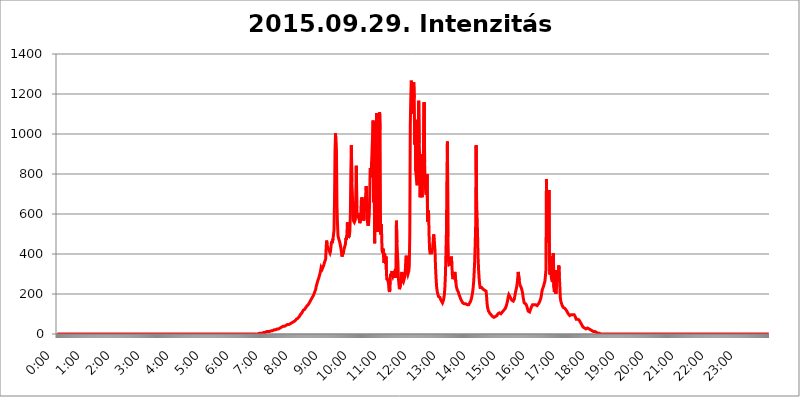
| Category | 2015.09.29. Intenzitás [W/m^2] |
|---|---|
| 0.0 | 0 |
| 0.0006944444444444445 | 0 |
| 0.001388888888888889 | 0 |
| 0.0020833333333333333 | 0 |
| 0.002777777777777778 | 0 |
| 0.003472222222222222 | 0 |
| 0.004166666666666667 | 0 |
| 0.004861111111111111 | 0 |
| 0.005555555555555556 | 0 |
| 0.0062499999999999995 | 0 |
| 0.006944444444444444 | 0 |
| 0.007638888888888889 | 0 |
| 0.008333333333333333 | 0 |
| 0.009027777777777779 | 0 |
| 0.009722222222222222 | 0 |
| 0.010416666666666666 | 0 |
| 0.011111111111111112 | 0 |
| 0.011805555555555555 | 0 |
| 0.012499999999999999 | 0 |
| 0.013194444444444444 | 0 |
| 0.013888888888888888 | 0 |
| 0.014583333333333332 | 0 |
| 0.015277777777777777 | 0 |
| 0.015972222222222224 | 0 |
| 0.016666666666666666 | 0 |
| 0.017361111111111112 | 0 |
| 0.018055555555555557 | 0 |
| 0.01875 | 0 |
| 0.019444444444444445 | 0 |
| 0.02013888888888889 | 0 |
| 0.020833333333333332 | 0 |
| 0.02152777777777778 | 0 |
| 0.022222222222222223 | 0 |
| 0.02291666666666667 | 0 |
| 0.02361111111111111 | 0 |
| 0.024305555555555556 | 0 |
| 0.024999999999999998 | 0 |
| 0.025694444444444447 | 0 |
| 0.02638888888888889 | 0 |
| 0.027083333333333334 | 0 |
| 0.027777777777777776 | 0 |
| 0.02847222222222222 | 0 |
| 0.029166666666666664 | 0 |
| 0.029861111111111113 | 0 |
| 0.030555555555555555 | 0 |
| 0.03125 | 0 |
| 0.03194444444444445 | 0 |
| 0.03263888888888889 | 0 |
| 0.03333333333333333 | 0 |
| 0.034027777777777775 | 0 |
| 0.034722222222222224 | 0 |
| 0.035416666666666666 | 0 |
| 0.036111111111111115 | 0 |
| 0.03680555555555556 | 0 |
| 0.0375 | 0 |
| 0.03819444444444444 | 0 |
| 0.03888888888888889 | 0 |
| 0.03958333333333333 | 0 |
| 0.04027777777777778 | 0 |
| 0.04097222222222222 | 0 |
| 0.041666666666666664 | 0 |
| 0.042361111111111106 | 0 |
| 0.04305555555555556 | 0 |
| 0.043750000000000004 | 0 |
| 0.044444444444444446 | 0 |
| 0.04513888888888889 | 0 |
| 0.04583333333333334 | 0 |
| 0.04652777777777778 | 0 |
| 0.04722222222222222 | 0 |
| 0.04791666666666666 | 0 |
| 0.04861111111111111 | 0 |
| 0.049305555555555554 | 0 |
| 0.049999999999999996 | 0 |
| 0.05069444444444445 | 0 |
| 0.051388888888888894 | 0 |
| 0.052083333333333336 | 0 |
| 0.05277777777777778 | 0 |
| 0.05347222222222222 | 0 |
| 0.05416666666666667 | 0 |
| 0.05486111111111111 | 0 |
| 0.05555555555555555 | 0 |
| 0.05625 | 0 |
| 0.05694444444444444 | 0 |
| 0.057638888888888885 | 0 |
| 0.05833333333333333 | 0 |
| 0.05902777777777778 | 0 |
| 0.059722222222222225 | 0 |
| 0.06041666666666667 | 0 |
| 0.061111111111111116 | 0 |
| 0.06180555555555556 | 0 |
| 0.0625 | 0 |
| 0.06319444444444444 | 0 |
| 0.06388888888888888 | 0 |
| 0.06458333333333334 | 0 |
| 0.06527777777777778 | 0 |
| 0.06597222222222222 | 0 |
| 0.06666666666666667 | 0 |
| 0.06736111111111111 | 0 |
| 0.06805555555555555 | 0 |
| 0.06874999999999999 | 0 |
| 0.06944444444444443 | 0 |
| 0.07013888888888889 | 0 |
| 0.07083333333333333 | 0 |
| 0.07152777777777779 | 0 |
| 0.07222222222222223 | 0 |
| 0.07291666666666667 | 0 |
| 0.07361111111111111 | 0 |
| 0.07430555555555556 | 0 |
| 0.075 | 0 |
| 0.07569444444444444 | 0 |
| 0.0763888888888889 | 0 |
| 0.07708333333333334 | 0 |
| 0.07777777777777778 | 0 |
| 0.07847222222222222 | 0 |
| 0.07916666666666666 | 0 |
| 0.0798611111111111 | 0 |
| 0.08055555555555556 | 0 |
| 0.08125 | 0 |
| 0.08194444444444444 | 0 |
| 0.08263888888888889 | 0 |
| 0.08333333333333333 | 0 |
| 0.08402777777777777 | 0 |
| 0.08472222222222221 | 0 |
| 0.08541666666666665 | 0 |
| 0.08611111111111112 | 0 |
| 0.08680555555555557 | 0 |
| 0.08750000000000001 | 0 |
| 0.08819444444444445 | 0 |
| 0.08888888888888889 | 0 |
| 0.08958333333333333 | 0 |
| 0.09027777777777778 | 0 |
| 0.09097222222222222 | 0 |
| 0.09166666666666667 | 0 |
| 0.09236111111111112 | 0 |
| 0.09305555555555556 | 0 |
| 0.09375 | 0 |
| 0.09444444444444444 | 0 |
| 0.09513888888888888 | 0 |
| 0.09583333333333333 | 0 |
| 0.09652777777777777 | 0 |
| 0.09722222222222222 | 0 |
| 0.09791666666666667 | 0 |
| 0.09861111111111111 | 0 |
| 0.09930555555555555 | 0 |
| 0.09999999999999999 | 0 |
| 0.10069444444444443 | 0 |
| 0.1013888888888889 | 0 |
| 0.10208333333333335 | 0 |
| 0.10277777777777779 | 0 |
| 0.10347222222222223 | 0 |
| 0.10416666666666667 | 0 |
| 0.10486111111111111 | 0 |
| 0.10555555555555556 | 0 |
| 0.10625 | 0 |
| 0.10694444444444444 | 0 |
| 0.1076388888888889 | 0 |
| 0.10833333333333334 | 0 |
| 0.10902777777777778 | 0 |
| 0.10972222222222222 | 0 |
| 0.1111111111111111 | 0 |
| 0.11180555555555556 | 0 |
| 0.11180555555555556 | 0 |
| 0.1125 | 0 |
| 0.11319444444444444 | 0 |
| 0.11388888888888889 | 0 |
| 0.11458333333333333 | 0 |
| 0.11527777777777777 | 0 |
| 0.11597222222222221 | 0 |
| 0.11666666666666665 | 0 |
| 0.1173611111111111 | 0 |
| 0.11805555555555557 | 0 |
| 0.11944444444444445 | 0 |
| 0.12013888888888889 | 0 |
| 0.12083333333333333 | 0 |
| 0.12152777777777778 | 0 |
| 0.12222222222222223 | 0 |
| 0.12291666666666667 | 0 |
| 0.12291666666666667 | 0 |
| 0.12361111111111112 | 0 |
| 0.12430555555555556 | 0 |
| 0.125 | 0 |
| 0.12569444444444444 | 0 |
| 0.12638888888888888 | 0 |
| 0.12708333333333333 | 0 |
| 0.16875 | 0 |
| 0.12847222222222224 | 0 |
| 0.12916666666666668 | 0 |
| 0.12986111111111112 | 0 |
| 0.13055555555555556 | 0 |
| 0.13125 | 0 |
| 0.13194444444444445 | 0 |
| 0.1326388888888889 | 0 |
| 0.13333333333333333 | 0 |
| 0.13402777777777777 | 0 |
| 0.13402777777777777 | 0 |
| 0.13472222222222222 | 0 |
| 0.13541666666666666 | 0 |
| 0.1361111111111111 | 0 |
| 0.13749999999999998 | 0 |
| 0.13819444444444443 | 0 |
| 0.1388888888888889 | 0 |
| 0.13958333333333334 | 0 |
| 0.14027777777777778 | 0 |
| 0.14097222222222222 | 0 |
| 0.14166666666666666 | 0 |
| 0.1423611111111111 | 0 |
| 0.14305555555555557 | 0 |
| 0.14375000000000002 | 0 |
| 0.14444444444444446 | 0 |
| 0.1451388888888889 | 0 |
| 0.1451388888888889 | 0 |
| 0.14652777777777778 | 0 |
| 0.14722222222222223 | 0 |
| 0.14791666666666667 | 0 |
| 0.1486111111111111 | 0 |
| 0.14930555555555555 | 0 |
| 0.15 | 0 |
| 0.15069444444444444 | 0 |
| 0.15138888888888888 | 0 |
| 0.15208333333333332 | 0 |
| 0.15277777777777776 | 0 |
| 0.15347222222222223 | 0 |
| 0.15416666666666667 | 0 |
| 0.15486111111111112 | 0 |
| 0.15555555555555556 | 0 |
| 0.15625 | 0 |
| 0.15694444444444444 | 0 |
| 0.15763888888888888 | 0 |
| 0.15833333333333333 | 0 |
| 0.15902777777777777 | 0 |
| 0.15972222222222224 | 0 |
| 0.16041666666666668 | 0 |
| 0.16111111111111112 | 0 |
| 0.16180555555555556 | 0 |
| 0.1625 | 0 |
| 0.16319444444444445 | 0 |
| 0.1638888888888889 | 0 |
| 0.16458333333333333 | 0 |
| 0.16527777777777777 | 0 |
| 0.16597222222222222 | 0 |
| 0.16666666666666666 | 0 |
| 0.1673611111111111 | 0 |
| 0.16805555555555554 | 0 |
| 0.16874999999999998 | 0 |
| 0.16944444444444443 | 0 |
| 0.17013888888888887 | 0 |
| 0.1708333333333333 | 0 |
| 0.17152777777777775 | 0 |
| 0.17222222222222225 | 0 |
| 0.1729166666666667 | 0 |
| 0.17361111111111113 | 0 |
| 0.17430555555555557 | 0 |
| 0.17500000000000002 | 0 |
| 0.17569444444444446 | 0 |
| 0.1763888888888889 | 0 |
| 0.17708333333333334 | 0 |
| 0.17777777777777778 | 0 |
| 0.17847222222222223 | 0 |
| 0.17916666666666667 | 0 |
| 0.1798611111111111 | 0 |
| 0.18055555555555555 | 0 |
| 0.18125 | 0 |
| 0.18194444444444444 | 0 |
| 0.1826388888888889 | 0 |
| 0.18333333333333335 | 0 |
| 0.1840277777777778 | 0 |
| 0.18472222222222223 | 0 |
| 0.18541666666666667 | 0 |
| 0.18611111111111112 | 0 |
| 0.18680555555555556 | 0 |
| 0.1875 | 0 |
| 0.18819444444444444 | 0 |
| 0.18888888888888888 | 0 |
| 0.18958333333333333 | 0 |
| 0.19027777777777777 | 0 |
| 0.1909722222222222 | 0 |
| 0.19166666666666665 | 0 |
| 0.19236111111111112 | 0 |
| 0.19305555555555554 | 0 |
| 0.19375 | 0 |
| 0.19444444444444445 | 0 |
| 0.1951388888888889 | 0 |
| 0.19583333333333333 | 0 |
| 0.19652777777777777 | 0 |
| 0.19722222222222222 | 0 |
| 0.19791666666666666 | 0 |
| 0.1986111111111111 | 0 |
| 0.19930555555555554 | 0 |
| 0.19999999999999998 | 0 |
| 0.20069444444444443 | 0 |
| 0.20138888888888887 | 0 |
| 0.2020833333333333 | 0 |
| 0.2027777777777778 | 0 |
| 0.2034722222222222 | 0 |
| 0.2041666666666667 | 0 |
| 0.20486111111111113 | 0 |
| 0.20555555555555557 | 0 |
| 0.20625000000000002 | 0 |
| 0.20694444444444446 | 0 |
| 0.2076388888888889 | 0 |
| 0.20833333333333334 | 0 |
| 0.20902777777777778 | 0 |
| 0.20972222222222223 | 0 |
| 0.21041666666666667 | 0 |
| 0.2111111111111111 | 0 |
| 0.21180555555555555 | 0 |
| 0.2125 | 0 |
| 0.21319444444444444 | 0 |
| 0.2138888888888889 | 0 |
| 0.21458333333333335 | 0 |
| 0.2152777777777778 | 0 |
| 0.21597222222222223 | 0 |
| 0.21666666666666667 | 0 |
| 0.21736111111111112 | 0 |
| 0.21805555555555556 | 0 |
| 0.21875 | 0 |
| 0.21944444444444444 | 0 |
| 0.22013888888888888 | 0 |
| 0.22083333333333333 | 0 |
| 0.22152777777777777 | 0 |
| 0.2222222222222222 | 0 |
| 0.22291666666666665 | 0 |
| 0.2236111111111111 | 0 |
| 0.22430555555555556 | 0 |
| 0.225 | 0 |
| 0.22569444444444445 | 0 |
| 0.2263888888888889 | 0 |
| 0.22708333333333333 | 0 |
| 0.22777777777777777 | 0 |
| 0.22847222222222222 | 0 |
| 0.22916666666666666 | 0 |
| 0.2298611111111111 | 0 |
| 0.23055555555555554 | 0 |
| 0.23124999999999998 | 0 |
| 0.23194444444444443 | 0 |
| 0.23263888888888887 | 0 |
| 0.2333333333333333 | 0 |
| 0.2340277777777778 | 0 |
| 0.2347222222222222 | 0 |
| 0.2354166666666667 | 0 |
| 0.23611111111111113 | 0 |
| 0.23680555555555557 | 0 |
| 0.23750000000000002 | 0 |
| 0.23819444444444446 | 0 |
| 0.2388888888888889 | 0 |
| 0.23958333333333334 | 0 |
| 0.24027777777777778 | 0 |
| 0.24097222222222223 | 0 |
| 0.24166666666666667 | 0 |
| 0.2423611111111111 | 0 |
| 0.24305555555555555 | 0 |
| 0.24375 | 0 |
| 0.24444444444444446 | 0 |
| 0.24513888888888888 | 0 |
| 0.24583333333333335 | 0 |
| 0.2465277777777778 | 0 |
| 0.24722222222222223 | 0 |
| 0.24791666666666667 | 0 |
| 0.24861111111111112 | 0 |
| 0.24930555555555556 | 0 |
| 0.25 | 0 |
| 0.25069444444444444 | 0 |
| 0.2513888888888889 | 0 |
| 0.2520833333333333 | 0 |
| 0.25277777777777777 | 0 |
| 0.2534722222222222 | 0 |
| 0.25416666666666665 | 0 |
| 0.2548611111111111 | 0 |
| 0.2555555555555556 | 0 |
| 0.25625000000000003 | 0 |
| 0.2569444444444445 | 0 |
| 0.2576388888888889 | 0 |
| 0.25833333333333336 | 0 |
| 0.2590277777777778 | 0 |
| 0.25972222222222224 | 0 |
| 0.2604166666666667 | 0 |
| 0.2611111111111111 | 0 |
| 0.26180555555555557 | 0 |
| 0.2625 | 0 |
| 0.26319444444444445 | 0 |
| 0.2638888888888889 | 0 |
| 0.26458333333333334 | 0 |
| 0.2652777777777778 | 0 |
| 0.2659722222222222 | 0 |
| 0.26666666666666666 | 0 |
| 0.2673611111111111 | 0 |
| 0.26805555555555555 | 0 |
| 0.26875 | 0 |
| 0.26944444444444443 | 0 |
| 0.2701388888888889 | 0 |
| 0.2708333333333333 | 0 |
| 0.27152777777777776 | 0 |
| 0.2722222222222222 | 0 |
| 0.27291666666666664 | 0 |
| 0.2736111111111111 | 0 |
| 0.2743055555555555 | 0 |
| 0.27499999999999997 | 0 |
| 0.27569444444444446 | 0 |
| 0.27638888888888885 | 0 |
| 0.27708333333333335 | 0 |
| 0.2777777777777778 | 0 |
| 0.27847222222222223 | 0 |
| 0.2791666666666667 | 0 |
| 0.2798611111111111 | 0 |
| 0.28055555555555556 | 0 |
| 0.28125 | 0 |
| 0.28194444444444444 | 0 |
| 0.2826388888888889 | 0 |
| 0.2833333333333333 | 3.525 |
| 0.28402777777777777 | 3.525 |
| 0.2847222222222222 | 3.525 |
| 0.28541666666666665 | 3.525 |
| 0.28611111111111115 | 3.525 |
| 0.28680555555555554 | 3.525 |
| 0.28750000000000003 | 3.525 |
| 0.2881944444444445 | 3.525 |
| 0.2888888888888889 | 3.525 |
| 0.28958333333333336 | 7.887 |
| 0.2902777777777778 | 7.887 |
| 0.29097222222222224 | 7.887 |
| 0.2916666666666667 | 7.887 |
| 0.2923611111111111 | 7.887 |
| 0.29305555555555557 | 12.257 |
| 0.29375 | 12.257 |
| 0.29444444444444445 | 12.257 |
| 0.2951388888888889 | 12.257 |
| 0.29583333333333334 | 12.257 |
| 0.2965277777777778 | 12.257 |
| 0.2972222222222222 | 12.257 |
| 0.29791666666666666 | 12.257 |
| 0.2986111111111111 | 12.257 |
| 0.29930555555555555 | 16.636 |
| 0.3 | 16.636 |
| 0.30069444444444443 | 16.636 |
| 0.3013888888888889 | 16.636 |
| 0.3020833333333333 | 16.636 |
| 0.30277777777777776 | 21.024 |
| 0.3034722222222222 | 21.024 |
| 0.30416666666666664 | 21.024 |
| 0.3048611111111111 | 21.024 |
| 0.3055555555555555 | 21.024 |
| 0.30624999999999997 | 21.024 |
| 0.3069444444444444 | 25.419 |
| 0.3076388888888889 | 25.419 |
| 0.30833333333333335 | 25.419 |
| 0.3090277777777778 | 25.419 |
| 0.30972222222222223 | 25.419 |
| 0.3104166666666667 | 25.419 |
| 0.3111111111111111 | 29.823 |
| 0.31180555555555556 | 29.823 |
| 0.3125 | 29.823 |
| 0.31319444444444444 | 29.823 |
| 0.3138888888888889 | 29.823 |
| 0.3145833333333333 | 34.234 |
| 0.31527777777777777 | 34.234 |
| 0.3159722222222222 | 34.234 |
| 0.31666666666666665 | 38.653 |
| 0.31736111111111115 | 38.653 |
| 0.31805555555555554 | 38.653 |
| 0.31875000000000003 | 38.653 |
| 0.3194444444444445 | 38.653 |
| 0.3201388888888889 | 43.079 |
| 0.32083333333333336 | 43.079 |
| 0.3215277777777778 | 43.079 |
| 0.32222222222222224 | 47.511 |
| 0.3229166666666667 | 47.511 |
| 0.3236111111111111 | 47.511 |
| 0.32430555555555557 | 47.511 |
| 0.325 | 47.511 |
| 0.32569444444444445 | 51.951 |
| 0.3263888888888889 | 51.951 |
| 0.32708333333333334 | 51.951 |
| 0.3277777777777778 | 56.398 |
| 0.3284722222222222 | 56.398 |
| 0.32916666666666666 | 56.398 |
| 0.3298611111111111 | 56.398 |
| 0.33055555555555555 | 60.85 |
| 0.33125 | 60.85 |
| 0.33194444444444443 | 65.31 |
| 0.3326388888888889 | 65.31 |
| 0.3333333333333333 | 65.31 |
| 0.3340277777777778 | 69.775 |
| 0.3347222222222222 | 69.775 |
| 0.3354166666666667 | 74.246 |
| 0.3361111111111111 | 74.246 |
| 0.3368055555555556 | 78.722 |
| 0.33749999999999997 | 78.722 |
| 0.33819444444444446 | 83.205 |
| 0.33888888888888885 | 83.205 |
| 0.33958333333333335 | 87.692 |
| 0.34027777777777773 | 92.184 |
| 0.34097222222222223 | 96.682 |
| 0.3416666666666666 | 101.184 |
| 0.3423611111111111 | 101.184 |
| 0.3430555555555555 | 105.69 |
| 0.34375 | 110.201 |
| 0.3444444444444445 | 110.201 |
| 0.3451388888888889 | 119.235 |
| 0.3458333333333334 | 119.235 |
| 0.34652777777777777 | 119.235 |
| 0.34722222222222227 | 123.758 |
| 0.34791666666666665 | 128.284 |
| 0.34861111111111115 | 132.814 |
| 0.34930555555555554 | 137.347 |
| 0.35000000000000003 | 137.347 |
| 0.3506944444444444 | 141.884 |
| 0.3513888888888889 | 146.423 |
| 0.3520833333333333 | 146.423 |
| 0.3527777777777778 | 150.964 |
| 0.3534722222222222 | 155.509 |
| 0.3541666666666667 | 160.056 |
| 0.3548611111111111 | 164.605 |
| 0.35555555555555557 | 169.156 |
| 0.35625 | 173.709 |
| 0.35694444444444445 | 178.264 |
| 0.3576388888888889 | 182.82 |
| 0.35833333333333334 | 187.378 |
| 0.3590277777777778 | 191.937 |
| 0.3597222222222222 | 196.497 |
| 0.36041666666666666 | 201.058 |
| 0.3611111111111111 | 210.182 |
| 0.36180555555555555 | 214.746 |
| 0.3625 | 223.873 |
| 0.36319444444444443 | 237.564 |
| 0.3638888888888889 | 246.689 |
| 0.3645833333333333 | 255.813 |
| 0.3652777777777778 | 264.932 |
| 0.3659722222222222 | 269.49 |
| 0.3666666666666667 | 278.603 |
| 0.3673611111111111 | 283.156 |
| 0.3680555555555556 | 296.808 |
| 0.36874999999999997 | 305.898 |
| 0.36944444444444446 | 319.517 |
| 0.37013888888888885 | 333.113 |
| 0.37083333333333335 | 328.584 |
| 0.37152777777777773 | 324.052 |
| 0.37222222222222223 | 324.052 |
| 0.3729166666666666 | 328.584 |
| 0.3736111111111111 | 342.162 |
| 0.3743055555555555 | 351.198 |
| 0.375 | 360.221 |
| 0.3756944444444445 | 364.728 |
| 0.3763888888888889 | 373.729 |
| 0.3770833333333334 | 422.943 |
| 0.37777777777777777 | 467.187 |
| 0.37847222222222227 | 449.551 |
| 0.37916666666666665 | 431.833 |
| 0.37986111111111115 | 427.39 |
| 0.38055555555555554 | 422.943 |
| 0.38125000000000003 | 427.39 |
| 0.3819444444444444 | 418.492 |
| 0.3826388888888889 | 405.108 |
| 0.3833333333333333 | 414.035 |
| 0.3840277777777778 | 440.702 |
| 0.3847222222222222 | 462.786 |
| 0.3854166666666667 | 453.968 |
| 0.3861111111111111 | 449.551 |
| 0.38680555555555557 | 475.972 |
| 0.3875 | 497.836 |
| 0.38819444444444445 | 519.555 |
| 0.3888888888888889 | 667.123 |
| 0.38958333333333334 | 913.766 |
| 0.3902777777777778 | 1003.65 |
| 0.3909722222222222 | 1003.65 |
| 0.39166666666666666 | 887.309 |
| 0.3923611111111111 | 634.105 |
| 0.39305555555555555 | 549.704 |
| 0.39375 | 493.475 |
| 0.39444444444444443 | 480.356 |
| 0.3951388888888889 | 471.582 |
| 0.3958333333333333 | 467.187 |
| 0.3965277777777778 | 453.968 |
| 0.3972222222222222 | 440.702 |
| 0.3979166666666667 | 427.39 |
| 0.3986111111111111 | 409.574 |
| 0.3993055555555556 | 387.202 |
| 0.39999999999999997 | 396.164 |
| 0.40069444444444446 | 391.685 |
| 0.40138888888888885 | 405.108 |
| 0.40208333333333335 | 422.943 |
| 0.40277777777777773 | 431.833 |
| 0.40347222222222223 | 427.39 |
| 0.4041666666666666 | 449.551 |
| 0.4048611111111111 | 480.356 |
| 0.4055555555555555 | 471.582 |
| 0.40625 | 493.475 |
| 0.4069444444444445 | 558.261 |
| 0.4076388888888889 | 497.836 |
| 0.4083333333333334 | 480.356 |
| 0.40902777777777777 | 480.356 |
| 0.40972222222222227 | 493.475 |
| 0.41041666666666665 | 515.223 |
| 0.41111111111111115 | 600.661 |
| 0.41180555555555554 | 814.519 |
| 0.41250000000000003 | 943.832 |
| 0.4131944444444444 | 759.723 |
| 0.4138888888888889 | 703.762 |
| 0.4145833333333333 | 613.252 |
| 0.4152777777777778 | 566.793 |
| 0.4159722222222222 | 562.53 |
| 0.4166666666666667 | 558.261 |
| 0.4173611111111111 | 558.261 |
| 0.41805555555555557 | 571.049 |
| 0.41875 | 703.762 |
| 0.41944444444444445 | 841.526 |
| 0.4201388888888889 | 634.105 |
| 0.42083333333333334 | 579.542 |
| 0.4215277777777778 | 588.009 |
| 0.4222222222222222 | 604.864 |
| 0.42291666666666666 | 609.062 |
| 0.4236111111111111 | 571.049 |
| 0.42430555555555555 | 553.986 |
| 0.425 | 553.986 |
| 0.42569444444444443 | 575.299 |
| 0.4263888888888889 | 663.019 |
| 0.4270833333333333 | 683.473 |
| 0.4277777777777778 | 687.544 |
| 0.4284722222222222 | 667.123 |
| 0.4291666666666667 | 604.864 |
| 0.4298611111111111 | 566.793 |
| 0.4305555555555556 | 588.009 |
| 0.43124999999999997 | 663.019 |
| 0.43194444444444446 | 667.123 |
| 0.43263888888888885 | 691.608 |
| 0.43333333333333335 | 739.877 |
| 0.43402777777777773 | 671.22 |
| 0.43472222222222223 | 579.542 |
| 0.4354166666666666 | 549.704 |
| 0.4361111111111111 | 541.121 |
| 0.4368055555555555 | 558.261 |
| 0.4375 | 592.233 |
| 0.4381944444444445 | 675.311 |
| 0.4388888888888889 | 829.981 |
| 0.4395833333333334 | 822.26 |
| 0.44027777777777777 | 783.342 |
| 0.44097222222222227 | 860.676 |
| 0.44166666666666665 | 932.576 |
| 0.44236111111111115 | 999.916 |
| 0.44305555555555554 | 1067.267 |
| 0.44375000000000003 | 658.909 |
| 0.4444444444444444 | 992.448 |
| 0.4451388888888889 | 453.968 |
| 0.4458333333333333 | 1059.756 |
| 0.4465277777777778 | 727.896 |
| 0.4472222222222222 | 921.298 |
| 0.4479166666666667 | 1105.019 |
| 0.4486111111111111 | 510.885 |
| 0.44930555555555557 | 532.513 |
| 0.45 | 642.4 |
| 0.45069444444444445 | 621.613 |
| 0.4513888888888889 | 592.233 |
| 0.45208333333333334 | 1108.816 |
| 0.4527777777777778 | 1022.323 |
| 0.4534722222222222 | 497.836 |
| 0.45416666666666666 | 549.704 |
| 0.4548611111111111 | 515.223 |
| 0.45555555555555555 | 418.492 |
| 0.45625 | 405.108 |
| 0.45694444444444443 | 427.39 |
| 0.4576388888888889 | 391.685 |
| 0.4583333333333333 | 355.712 |
| 0.4590277777777778 | 405.108 |
| 0.4597222222222222 | 378.224 |
| 0.4604166666666667 | 351.198 |
| 0.4611111111111111 | 387.202 |
| 0.4618055555555556 | 296.808 |
| 0.46249999999999997 | 269.49 |
| 0.46319444444444446 | 278.603 |
| 0.46388888888888885 | 283.156 |
| 0.46458333333333335 | 255.813 |
| 0.46527777777777773 | 219.309 |
| 0.46597222222222223 | 210.182 |
| 0.4666666666666666 | 223.873 |
| 0.4673611111111111 | 301.354 |
| 0.4680555555555555 | 287.709 |
| 0.46875 | 301.354 |
| 0.4694444444444445 | 314.98 |
| 0.4701388888888889 | 296.808 |
| 0.4708333333333334 | 287.709 |
| 0.47152777777777777 | 287.709 |
| 0.47222222222222227 | 301.354 |
| 0.47291666666666665 | 287.709 |
| 0.47361111111111115 | 292.259 |
| 0.47430555555555554 | 287.709 |
| 0.47500000000000003 | 287.709 |
| 0.4756944444444444 | 566.793 |
| 0.4763888888888889 | 458.38 |
| 0.4770833333333333 | 409.574 |
| 0.4777777777777778 | 360.221 |
| 0.4784722222222222 | 278.603 |
| 0.4791666666666667 | 251.251 |
| 0.4798611111111111 | 223.873 |
| 0.48055555555555557 | 219.309 |
| 0.48125 | 242.127 |
| 0.48194444444444445 | 260.373 |
| 0.4826388888888889 | 264.932 |
| 0.48333333333333334 | 310.44 |
| 0.4840277777777778 | 269.49 |
| 0.4847222222222222 | 264.932 |
| 0.48541666666666666 | 260.373 |
| 0.4861111111111111 | 255.813 |
| 0.48680555555555555 | 264.932 |
| 0.4875 | 287.709 |
| 0.48819444444444443 | 319.517 |
| 0.4888888888888889 | 373.729 |
| 0.4895833333333333 | 391.685 |
| 0.4902777777777778 | 337.639 |
| 0.4909722222222222 | 305.898 |
| 0.4916666666666667 | 296.808 |
| 0.4923611111111111 | 301.354 |
| 0.4930555555555556 | 314.98 |
| 0.49374999999999997 | 342.162 |
| 0.49444444444444446 | 497.836 |
| 0.49513888888888885 | 1041.019 |
| 0.49583333333333335 | 1174.263 |
| 0.49652777777777773 | 1266.8 |
| 0.49722222222222223 | 1246.176 |
| 0.4979166666666666 | 1101.226 |
| 0.4986111111111111 | 1221.83 |
| 0.4993055555555555 | 1242.089 |
| 0.5 | 1258.511 |
| 0.5006944444444444 | 1178.177 |
| 0.5013888888888889 | 947.58 |
| 0.5020833333333333 | 1071.027 |
| 0.5027777777777778 | 814.519 |
| 0.5034722222222222 | 791.169 |
| 0.5041666666666667 | 759.723 |
| 0.5048611111111111 | 743.859 |
| 0.5055555555555555 | 806.757 |
| 0.50625 | 940.082 |
| 0.5069444444444444 | 1166.46 |
| 0.5076388888888889 | 955.071 |
| 0.5083333333333333 | 875.918 |
| 0.5090277777777777 | 683.473 |
| 0.5097222222222222 | 898.668 |
| 0.5104166666666666 | 767.62 |
| 0.5111111111111112 | 695.666 |
| 0.5118055555555555 | 683.473 |
| 0.5125000000000001 | 818.392 |
| 0.5131944444444444 | 791.169 |
| 0.513888888888889 | 795.074 |
| 0.5145833333333333 | 1158.689 |
| 0.5152777777777778 | 853.029 |
| 0.5159722222222222 | 755.766 |
| 0.5166666666666667 | 719.877 |
| 0.517361111111111 | 695.666 |
| 0.5180555555555556 | 699.717 |
| 0.5187499999999999 | 798.974 |
| 0.5194444444444445 | 562.53 |
| 0.5201388888888888 | 617.436 |
| 0.5208333333333334 | 609.062 |
| 0.5215277777777778 | 493.475 |
| 0.5222222222222223 | 422.943 |
| 0.5229166666666667 | 405.108 |
| 0.5236111111111111 | 405.108 |
| 0.5243055555555556 | 409.574 |
| 0.525 | 405.108 |
| 0.5256944444444445 | 405.108 |
| 0.5263888888888889 | 427.39 |
| 0.5270833333333333 | 453.968 |
| 0.5277777777777778 | 497.836 |
| 0.5284722222222222 | 489.108 |
| 0.5291666666666667 | 449.551 |
| 0.5298611111111111 | 414.035 |
| 0.5305555555555556 | 333.113 |
| 0.53125 | 283.156 |
| 0.5319444444444444 | 242.127 |
| 0.5326388888888889 | 219.309 |
| 0.5333333333333333 | 205.62 |
| 0.5340277777777778 | 196.497 |
| 0.5347222222222222 | 187.378 |
| 0.5354166666666667 | 187.378 |
| 0.5361111111111111 | 182.82 |
| 0.5368055555555555 | 182.82 |
| 0.5375 | 173.709 |
| 0.5381944444444444 | 169.156 |
| 0.5388888888888889 | 164.605 |
| 0.5395833333333333 | 160.056 |
| 0.5402777777777777 | 155.509 |
| 0.5409722222222222 | 160.056 |
| 0.5416666666666666 | 169.156 |
| 0.5423611111111112 | 182.82 |
| 0.5430555555555555 | 201.058 |
| 0.5437500000000001 | 237.564 |
| 0.5444444444444444 | 296.808 |
| 0.545138888888889 | 400.638 |
| 0.5458333333333333 | 506.542 |
| 0.5465277777777778 | 787.258 |
| 0.5472222222222222 | 962.555 |
| 0.5479166666666667 | 484.735 |
| 0.548611111111111 | 369.23 |
| 0.5493055555555556 | 346.682 |
| 0.5499999999999999 | 342.162 |
| 0.5506944444444445 | 342.162 |
| 0.5513888888888888 | 351.198 |
| 0.5520833333333334 | 360.221 |
| 0.5527777777777778 | 387.202 |
| 0.5534722222222223 | 342.162 |
| 0.5541666666666667 | 296.808 |
| 0.5548611111111111 | 274.047 |
| 0.5555555555555556 | 269.49 |
| 0.55625 | 287.709 |
| 0.5569444444444445 | 301.354 |
| 0.5576388888888889 | 310.44 |
| 0.5583333333333333 | 310.44 |
| 0.5590277777777778 | 260.373 |
| 0.5597222222222222 | 237.564 |
| 0.5604166666666667 | 228.436 |
| 0.5611111111111111 | 219.309 |
| 0.5618055555555556 | 214.746 |
| 0.5625 | 210.182 |
| 0.5631944444444444 | 201.058 |
| 0.5638888888888889 | 196.497 |
| 0.5645833333333333 | 187.378 |
| 0.5652777777777778 | 182.82 |
| 0.5659722222222222 | 173.709 |
| 0.5666666666666667 | 169.156 |
| 0.5673611111111111 | 164.605 |
| 0.5680555555555555 | 160.056 |
| 0.56875 | 155.509 |
| 0.5694444444444444 | 150.964 |
| 0.5701388888888889 | 150.964 |
| 0.5708333333333333 | 150.964 |
| 0.5715277777777777 | 150.964 |
| 0.5722222222222222 | 150.964 |
| 0.5729166666666666 | 150.964 |
| 0.5736111111111112 | 150.964 |
| 0.5743055555555555 | 146.423 |
| 0.5750000000000001 | 146.423 |
| 0.5756944444444444 | 146.423 |
| 0.576388888888889 | 146.423 |
| 0.5770833333333333 | 146.423 |
| 0.5777777777777778 | 150.964 |
| 0.5784722222222222 | 155.509 |
| 0.5791666666666667 | 160.056 |
| 0.579861111111111 | 164.605 |
| 0.5805555555555556 | 173.709 |
| 0.5812499999999999 | 182.82 |
| 0.5819444444444445 | 196.497 |
| 0.5826388888888888 | 210.182 |
| 0.5833333333333334 | 233 |
| 0.5840277777777778 | 260.373 |
| 0.5847222222222223 | 305.898 |
| 0.5854166666666667 | 360.221 |
| 0.5861111111111111 | 436.27 |
| 0.5868055555555556 | 536.82 |
| 0.5875 | 943.832 |
| 0.5881944444444445 | 658.909 |
| 0.5888888888888889 | 579.542 |
| 0.5895833333333333 | 484.735 |
| 0.5902777777777778 | 378.224 |
| 0.5909722222222222 | 319.517 |
| 0.5916666666666667 | 278.603 |
| 0.5923611111111111 | 251.251 |
| 0.5930555555555556 | 233 |
| 0.59375 | 228.436 |
| 0.5944444444444444 | 228.436 |
| 0.5951388888888889 | 233 |
| 0.5958333333333333 | 233 |
| 0.5965277777777778 | 233 |
| 0.5972222222222222 | 223.873 |
| 0.5979166666666667 | 219.309 |
| 0.5986111111111111 | 219.309 |
| 0.5993055555555555 | 219.309 |
| 0.6 | 219.309 |
| 0.6006944444444444 | 219.309 |
| 0.6013888888888889 | 214.746 |
| 0.6020833333333333 | 191.937 |
| 0.6027777777777777 | 155.509 |
| 0.6034722222222222 | 132.814 |
| 0.6041666666666666 | 123.758 |
| 0.6048611111111112 | 114.716 |
| 0.6055555555555555 | 110.201 |
| 0.6062500000000001 | 105.69 |
| 0.6069444444444444 | 101.184 |
| 0.607638888888889 | 101.184 |
| 0.6083333333333333 | 96.682 |
| 0.6090277777777778 | 96.682 |
| 0.6097222222222222 | 92.184 |
| 0.6104166666666667 | 87.692 |
| 0.611111111111111 | 83.205 |
| 0.6118055555555556 | 83.205 |
| 0.6124999999999999 | 83.205 |
| 0.6131944444444445 | 83.205 |
| 0.6138888888888888 | 83.205 |
| 0.6145833333333334 | 87.692 |
| 0.6152777777777778 | 87.692 |
| 0.6159722222222223 | 87.692 |
| 0.6166666666666667 | 92.184 |
| 0.6173611111111111 | 96.682 |
| 0.6180555555555556 | 101.184 |
| 0.61875 | 101.184 |
| 0.6194444444444445 | 105.69 |
| 0.6201388888888889 | 105.69 |
| 0.6208333333333333 | 105.69 |
| 0.6215277777777778 | 105.69 |
| 0.6222222222222222 | 101.184 |
| 0.6229166666666667 | 101.184 |
| 0.6236111111111111 | 105.69 |
| 0.6243055555555556 | 110.201 |
| 0.625 | 110.201 |
| 0.6256944444444444 | 114.716 |
| 0.6263888888888889 | 119.235 |
| 0.6270833333333333 | 119.235 |
| 0.6277777777777778 | 123.758 |
| 0.6284722222222222 | 128.284 |
| 0.6291666666666667 | 132.814 |
| 0.6298611111111111 | 141.884 |
| 0.6305555555555555 | 150.964 |
| 0.63125 | 160.056 |
| 0.6319444444444444 | 173.709 |
| 0.6326388888888889 | 187.378 |
| 0.6333333333333333 | 196.497 |
| 0.6340277777777777 | 201.058 |
| 0.6347222222222222 | 191.937 |
| 0.6354166666666666 | 182.82 |
| 0.6361111111111112 | 178.264 |
| 0.6368055555555555 | 178.264 |
| 0.6375000000000001 | 169.156 |
| 0.6381944444444444 | 164.605 |
| 0.638888888888889 | 164.605 |
| 0.6395833333333333 | 164.605 |
| 0.6402777777777778 | 164.605 |
| 0.6409722222222222 | 173.709 |
| 0.6416666666666667 | 187.378 |
| 0.642361111111111 | 201.058 |
| 0.6430555555555556 | 214.746 |
| 0.6437499999999999 | 223.873 |
| 0.6444444444444445 | 237.564 |
| 0.6451388888888888 | 255.813 |
| 0.6458333333333334 | 278.603 |
| 0.6465277777777778 | 310.44 |
| 0.6472222222222223 | 310.44 |
| 0.6479166666666667 | 269.49 |
| 0.6486111111111111 | 251.251 |
| 0.6493055555555556 | 242.127 |
| 0.65 | 237.564 |
| 0.6506944444444445 | 233 |
| 0.6513888888888889 | 223.873 |
| 0.6520833333333333 | 214.746 |
| 0.6527777777777778 | 201.058 |
| 0.6534722222222222 | 182.82 |
| 0.6541666666666667 | 169.156 |
| 0.6548611111111111 | 155.509 |
| 0.6555555555555556 | 150.964 |
| 0.65625 | 150.964 |
| 0.6569444444444444 | 150.964 |
| 0.6576388888888889 | 146.423 |
| 0.6583333333333333 | 141.884 |
| 0.6590277777777778 | 132.814 |
| 0.6597222222222222 | 123.758 |
| 0.6604166666666667 | 114.716 |
| 0.6611111111111111 | 110.201 |
| 0.6618055555555555 | 110.201 |
| 0.6625 | 110.201 |
| 0.6631944444444444 | 114.716 |
| 0.6638888888888889 | 123.758 |
| 0.6645833333333333 | 128.284 |
| 0.6652777777777777 | 137.347 |
| 0.6659722222222222 | 141.884 |
| 0.6666666666666666 | 146.423 |
| 0.6673611111111111 | 150.964 |
| 0.6680555555555556 | 146.423 |
| 0.6687500000000001 | 146.423 |
| 0.6694444444444444 | 146.423 |
| 0.6701388888888888 | 141.884 |
| 0.6708333333333334 | 146.423 |
| 0.6715277777777778 | 141.884 |
| 0.6722222222222222 | 141.884 |
| 0.6729166666666666 | 141.884 |
| 0.6736111111111112 | 146.423 |
| 0.6743055555555556 | 146.423 |
| 0.6749999999999999 | 150.964 |
| 0.6756944444444444 | 155.509 |
| 0.6763888888888889 | 160.056 |
| 0.6770833333333334 | 164.605 |
| 0.6777777777777777 | 173.709 |
| 0.6784722222222223 | 182.82 |
| 0.6791666666666667 | 196.497 |
| 0.6798611111111111 | 214.746 |
| 0.6805555555555555 | 223.873 |
| 0.68125 | 228.436 |
| 0.6819444444444445 | 237.564 |
| 0.6826388888888889 | 246.689 |
| 0.6833333333333332 | 255.813 |
| 0.6840277777777778 | 264.932 |
| 0.6847222222222222 | 269.49 |
| 0.6854166666666667 | 319.517 |
| 0.686111111111111 | 775.492 |
| 0.6868055555555556 | 506.542 |
| 0.6875 | 471.582 |
| 0.6881944444444444 | 617.436 |
| 0.688888888888889 | 458.38 |
| 0.6895833333333333 | 719.877 |
| 0.6902777777777778 | 364.728 |
| 0.6909722222222222 | 296.808 |
| 0.6916666666666668 | 387.202 |
| 0.6923611111111111 | 364.728 |
| 0.6930555555555555 | 278.603 |
| 0.69375 | 278.603 |
| 0.6944444444444445 | 260.373 |
| 0.6951388888888889 | 255.813 |
| 0.6958333333333333 | 405.108 |
| 0.6965277777777777 | 233 |
| 0.6972222222222223 | 210.182 |
| 0.6979166666666666 | 214.746 |
| 0.6986111111111111 | 319.517 |
| 0.6993055555555556 | 201.058 |
| 0.7000000000000001 | 201.058 |
| 0.7006944444444444 | 278.603 |
| 0.7013888888888888 | 283.156 |
| 0.7020833333333334 | 314.98 |
| 0.7027777777777778 | 301.354 |
| 0.7034722222222222 | 342.162 |
| 0.7041666666666666 | 287.709 |
| 0.7048611111111112 | 242.127 |
| 0.7055555555555556 | 182.82 |
| 0.7062499999999999 | 164.605 |
| 0.7069444444444444 | 155.509 |
| 0.7076388888888889 | 150.964 |
| 0.7083333333333334 | 141.884 |
| 0.7090277777777777 | 137.347 |
| 0.7097222222222223 | 132.814 |
| 0.7104166666666667 | 128.284 |
| 0.7111111111111111 | 128.284 |
| 0.7118055555555555 | 128.284 |
| 0.7125 | 128.284 |
| 0.7131944444444445 | 123.758 |
| 0.7138888888888889 | 119.235 |
| 0.7145833333333332 | 119.235 |
| 0.7152777777777778 | 110.201 |
| 0.7159722222222222 | 105.69 |
| 0.7166666666666667 | 101.184 |
| 0.717361111111111 | 96.682 |
| 0.7180555555555556 | 96.682 |
| 0.71875 | 92.184 |
| 0.7194444444444444 | 92.184 |
| 0.720138888888889 | 92.184 |
| 0.7208333333333333 | 96.682 |
| 0.7215277777777778 | 96.682 |
| 0.7222222222222222 | 96.682 |
| 0.7229166666666668 | 96.682 |
| 0.7236111111111111 | 101.184 |
| 0.7243055555555555 | 96.682 |
| 0.725 | 96.682 |
| 0.7256944444444445 | 92.184 |
| 0.7263888888888889 | 87.692 |
| 0.7270833333333333 | 83.205 |
| 0.7277777777777777 | 74.246 |
| 0.7284722222222223 | 74.246 |
| 0.7291666666666666 | 74.246 |
| 0.7298611111111111 | 74.246 |
| 0.7305555555555556 | 74.246 |
| 0.7312500000000001 | 69.775 |
| 0.7319444444444444 | 69.775 |
| 0.7326388888888888 | 65.31 |
| 0.7333333333333334 | 60.85 |
| 0.7340277777777778 | 56.398 |
| 0.7347222222222222 | 51.951 |
| 0.7354166666666666 | 47.511 |
| 0.7361111111111112 | 43.079 |
| 0.7368055555555556 | 38.653 |
| 0.7374999999999999 | 34.234 |
| 0.7381944444444444 | 34.234 |
| 0.7388888888888889 | 29.823 |
| 0.7395833333333334 | 29.823 |
| 0.7402777777777777 | 25.419 |
| 0.7409722222222223 | 25.419 |
| 0.7416666666666667 | 25.419 |
| 0.7423611111111111 | 29.823 |
| 0.7430555555555555 | 29.823 |
| 0.74375 | 29.823 |
| 0.7444444444444445 | 29.823 |
| 0.7451388888888889 | 25.419 |
| 0.7458333333333332 | 25.419 |
| 0.7465277777777778 | 25.419 |
| 0.7472222222222222 | 21.024 |
| 0.7479166666666667 | 21.024 |
| 0.748611111111111 | 21.024 |
| 0.7493055555555556 | 21.024 |
| 0.75 | 16.636 |
| 0.7506944444444444 | 16.636 |
| 0.751388888888889 | 16.636 |
| 0.7520833333333333 | 12.257 |
| 0.7527777777777778 | 12.257 |
| 0.7534722222222222 | 12.257 |
| 0.7541666666666668 | 12.257 |
| 0.7548611111111111 | 12.257 |
| 0.7555555555555555 | 7.887 |
| 0.75625 | 7.887 |
| 0.7569444444444445 | 7.887 |
| 0.7576388888888889 | 3.525 |
| 0.7583333333333333 | 3.525 |
| 0.7590277777777777 | 3.525 |
| 0.7597222222222223 | 3.525 |
| 0.7604166666666666 | 3.525 |
| 0.7611111111111111 | 3.525 |
| 0.7618055555555556 | 3.525 |
| 0.7625000000000001 | 0 |
| 0.7631944444444444 | 0 |
| 0.7638888888888888 | 0 |
| 0.7645833333333334 | 0 |
| 0.7652777777777778 | 0 |
| 0.7659722222222222 | 0 |
| 0.7666666666666666 | 0 |
| 0.7673611111111112 | 0 |
| 0.7680555555555556 | 0 |
| 0.7687499999999999 | 0 |
| 0.7694444444444444 | 0 |
| 0.7701388888888889 | 0 |
| 0.7708333333333334 | 0 |
| 0.7715277777777777 | 0 |
| 0.7722222222222223 | 0 |
| 0.7729166666666667 | 0 |
| 0.7736111111111111 | 0 |
| 0.7743055555555555 | 0 |
| 0.775 | 0 |
| 0.7756944444444445 | 0 |
| 0.7763888888888889 | 0 |
| 0.7770833333333332 | 0 |
| 0.7777777777777778 | 0 |
| 0.7784722222222222 | 0 |
| 0.7791666666666667 | 0 |
| 0.779861111111111 | 0 |
| 0.7805555555555556 | 0 |
| 0.78125 | 0 |
| 0.7819444444444444 | 0 |
| 0.782638888888889 | 0 |
| 0.7833333333333333 | 0 |
| 0.7840277777777778 | 0 |
| 0.7847222222222222 | 0 |
| 0.7854166666666668 | 0 |
| 0.7861111111111111 | 0 |
| 0.7868055555555555 | 0 |
| 0.7875 | 0 |
| 0.7881944444444445 | 0 |
| 0.7888888888888889 | 0 |
| 0.7895833333333333 | 0 |
| 0.7902777777777777 | 0 |
| 0.7909722222222223 | 0 |
| 0.7916666666666666 | 0 |
| 0.7923611111111111 | 0 |
| 0.7930555555555556 | 0 |
| 0.7937500000000001 | 0 |
| 0.7944444444444444 | 0 |
| 0.7951388888888888 | 0 |
| 0.7958333333333334 | 0 |
| 0.7965277777777778 | 0 |
| 0.7972222222222222 | 0 |
| 0.7979166666666666 | 0 |
| 0.7986111111111112 | 0 |
| 0.7993055555555556 | 0 |
| 0.7999999999999999 | 0 |
| 0.8006944444444444 | 0 |
| 0.8013888888888889 | 0 |
| 0.8020833333333334 | 0 |
| 0.8027777777777777 | 0 |
| 0.8034722222222223 | 0 |
| 0.8041666666666667 | 0 |
| 0.8048611111111111 | 0 |
| 0.8055555555555555 | 0 |
| 0.80625 | 0 |
| 0.8069444444444445 | 0 |
| 0.8076388888888889 | 0 |
| 0.8083333333333332 | 0 |
| 0.8090277777777778 | 0 |
| 0.8097222222222222 | 0 |
| 0.8104166666666667 | 0 |
| 0.811111111111111 | 0 |
| 0.8118055555555556 | 0 |
| 0.8125 | 0 |
| 0.8131944444444444 | 0 |
| 0.813888888888889 | 0 |
| 0.8145833333333333 | 0 |
| 0.8152777777777778 | 0 |
| 0.8159722222222222 | 0 |
| 0.8166666666666668 | 0 |
| 0.8173611111111111 | 0 |
| 0.8180555555555555 | 0 |
| 0.81875 | 0 |
| 0.8194444444444445 | 0 |
| 0.8201388888888889 | 0 |
| 0.8208333333333333 | 0 |
| 0.8215277777777777 | 0 |
| 0.8222222222222223 | 0 |
| 0.8229166666666666 | 0 |
| 0.8236111111111111 | 0 |
| 0.8243055555555556 | 0 |
| 0.8250000000000001 | 0 |
| 0.8256944444444444 | 0 |
| 0.8263888888888888 | 0 |
| 0.8270833333333334 | 0 |
| 0.8277777777777778 | 0 |
| 0.8284722222222222 | 0 |
| 0.8291666666666666 | 0 |
| 0.8298611111111112 | 0 |
| 0.8305555555555556 | 0 |
| 0.8312499999999999 | 0 |
| 0.8319444444444444 | 0 |
| 0.8326388888888889 | 0 |
| 0.8333333333333334 | 0 |
| 0.8340277777777777 | 0 |
| 0.8347222222222223 | 0 |
| 0.8354166666666667 | 0 |
| 0.8361111111111111 | 0 |
| 0.8368055555555555 | 0 |
| 0.8375 | 0 |
| 0.8381944444444445 | 0 |
| 0.8388888888888889 | 0 |
| 0.8395833333333332 | 0 |
| 0.8402777777777778 | 0 |
| 0.8409722222222222 | 0 |
| 0.8416666666666667 | 0 |
| 0.842361111111111 | 0 |
| 0.8430555555555556 | 0 |
| 0.84375 | 0 |
| 0.8444444444444444 | 0 |
| 0.845138888888889 | 0 |
| 0.8458333333333333 | 0 |
| 0.8465277777777778 | 0 |
| 0.8472222222222222 | 0 |
| 0.8479166666666668 | 0 |
| 0.8486111111111111 | 0 |
| 0.8493055555555555 | 0 |
| 0.85 | 0 |
| 0.8506944444444445 | 0 |
| 0.8513888888888889 | 0 |
| 0.8520833333333333 | 0 |
| 0.8527777777777777 | 0 |
| 0.8534722222222223 | 0 |
| 0.8541666666666666 | 0 |
| 0.8548611111111111 | 0 |
| 0.8555555555555556 | 0 |
| 0.8562500000000001 | 0 |
| 0.8569444444444444 | 0 |
| 0.8576388888888888 | 0 |
| 0.8583333333333334 | 0 |
| 0.8590277777777778 | 0 |
| 0.8597222222222222 | 0 |
| 0.8604166666666666 | 0 |
| 0.8611111111111112 | 0 |
| 0.8618055555555556 | 0 |
| 0.8624999999999999 | 0 |
| 0.8631944444444444 | 0 |
| 0.8638888888888889 | 0 |
| 0.8645833333333334 | 0 |
| 0.8652777777777777 | 0 |
| 0.8659722222222223 | 0 |
| 0.8666666666666667 | 0 |
| 0.8673611111111111 | 0 |
| 0.8680555555555555 | 0 |
| 0.86875 | 0 |
| 0.8694444444444445 | 0 |
| 0.8701388888888889 | 0 |
| 0.8708333333333332 | 0 |
| 0.8715277777777778 | 0 |
| 0.8722222222222222 | 0 |
| 0.8729166666666667 | 0 |
| 0.873611111111111 | 0 |
| 0.8743055555555556 | 0 |
| 0.875 | 0 |
| 0.8756944444444444 | 0 |
| 0.876388888888889 | 0 |
| 0.8770833333333333 | 0 |
| 0.8777777777777778 | 0 |
| 0.8784722222222222 | 0 |
| 0.8791666666666668 | 0 |
| 0.8798611111111111 | 0 |
| 0.8805555555555555 | 0 |
| 0.88125 | 0 |
| 0.8819444444444445 | 0 |
| 0.8826388888888889 | 0 |
| 0.8833333333333333 | 0 |
| 0.8840277777777777 | 0 |
| 0.8847222222222223 | 0 |
| 0.8854166666666666 | 0 |
| 0.8861111111111111 | 0 |
| 0.8868055555555556 | 0 |
| 0.8875000000000001 | 0 |
| 0.8881944444444444 | 0 |
| 0.8888888888888888 | 0 |
| 0.8895833333333334 | 0 |
| 0.8902777777777778 | 0 |
| 0.8909722222222222 | 0 |
| 0.8916666666666666 | 0 |
| 0.8923611111111112 | 0 |
| 0.8930555555555556 | 0 |
| 0.8937499999999999 | 0 |
| 0.8944444444444444 | 0 |
| 0.8951388888888889 | 0 |
| 0.8958333333333334 | 0 |
| 0.8965277777777777 | 0 |
| 0.8972222222222223 | 0 |
| 0.8979166666666667 | 0 |
| 0.8986111111111111 | 0 |
| 0.8993055555555555 | 0 |
| 0.9 | 0 |
| 0.9006944444444445 | 0 |
| 0.9013888888888889 | 0 |
| 0.9020833333333332 | 0 |
| 0.9027777777777778 | 0 |
| 0.9034722222222222 | 0 |
| 0.9041666666666667 | 0 |
| 0.904861111111111 | 0 |
| 0.9055555555555556 | 0 |
| 0.90625 | 0 |
| 0.9069444444444444 | 0 |
| 0.907638888888889 | 0 |
| 0.9083333333333333 | 0 |
| 0.9090277777777778 | 0 |
| 0.9097222222222222 | 0 |
| 0.9104166666666668 | 0 |
| 0.9111111111111111 | 0 |
| 0.9118055555555555 | 0 |
| 0.9125 | 0 |
| 0.9131944444444445 | 0 |
| 0.9138888888888889 | 0 |
| 0.9145833333333333 | 0 |
| 0.9152777777777777 | 0 |
| 0.9159722222222223 | 0 |
| 0.9166666666666666 | 0 |
| 0.9173611111111111 | 0 |
| 0.9180555555555556 | 0 |
| 0.9187500000000001 | 0 |
| 0.9194444444444444 | 0 |
| 0.9201388888888888 | 0 |
| 0.9208333333333334 | 0 |
| 0.9215277777777778 | 0 |
| 0.9222222222222222 | 0 |
| 0.9229166666666666 | 0 |
| 0.9236111111111112 | 0 |
| 0.9243055555555556 | 0 |
| 0.9249999999999999 | 0 |
| 0.9256944444444444 | 0 |
| 0.9263888888888889 | 0 |
| 0.9270833333333334 | 0 |
| 0.9277777777777777 | 0 |
| 0.9284722222222223 | 0 |
| 0.9291666666666667 | 0 |
| 0.9298611111111111 | 0 |
| 0.9305555555555555 | 0 |
| 0.93125 | 0 |
| 0.9319444444444445 | 0 |
| 0.9326388888888889 | 0 |
| 0.9333333333333332 | 0 |
| 0.9340277777777778 | 0 |
| 0.9347222222222222 | 0 |
| 0.9354166666666667 | 0 |
| 0.936111111111111 | 0 |
| 0.9368055555555556 | 0 |
| 0.9375 | 0 |
| 0.9381944444444444 | 0 |
| 0.938888888888889 | 0 |
| 0.9395833333333333 | 0 |
| 0.9402777777777778 | 0 |
| 0.9409722222222222 | 0 |
| 0.9416666666666668 | 0 |
| 0.9423611111111111 | 0 |
| 0.9430555555555555 | 0 |
| 0.94375 | 0 |
| 0.9444444444444445 | 0 |
| 0.9451388888888889 | 0 |
| 0.9458333333333333 | 0 |
| 0.9465277777777777 | 0 |
| 0.9472222222222223 | 0 |
| 0.9479166666666666 | 0 |
| 0.9486111111111111 | 0 |
| 0.9493055555555556 | 0 |
| 0.9500000000000001 | 0 |
| 0.9506944444444444 | 0 |
| 0.9513888888888888 | 0 |
| 0.9520833333333334 | 0 |
| 0.9527777777777778 | 0 |
| 0.9534722222222222 | 0 |
| 0.9541666666666666 | 0 |
| 0.9548611111111112 | 0 |
| 0.9555555555555556 | 0 |
| 0.9562499999999999 | 0 |
| 0.9569444444444444 | 0 |
| 0.9576388888888889 | 0 |
| 0.9583333333333334 | 0 |
| 0.9590277777777777 | 0 |
| 0.9597222222222223 | 0 |
| 0.9604166666666667 | 0 |
| 0.9611111111111111 | 0 |
| 0.9618055555555555 | 0 |
| 0.9625 | 0 |
| 0.9631944444444445 | 0 |
| 0.9638888888888889 | 0 |
| 0.9645833333333332 | 0 |
| 0.9652777777777778 | 0 |
| 0.9659722222222222 | 0 |
| 0.9666666666666667 | 0 |
| 0.967361111111111 | 0 |
| 0.9680555555555556 | 0 |
| 0.96875 | 0 |
| 0.9694444444444444 | 0 |
| 0.970138888888889 | 0 |
| 0.9708333333333333 | 0 |
| 0.9715277777777778 | 0 |
| 0.9722222222222222 | 0 |
| 0.9729166666666668 | 0 |
| 0.9736111111111111 | 0 |
| 0.9743055555555555 | 0 |
| 0.975 | 0 |
| 0.9756944444444445 | 0 |
| 0.9763888888888889 | 0 |
| 0.9770833333333333 | 0 |
| 0.9777777777777777 | 0 |
| 0.9784722222222223 | 0 |
| 0.9791666666666666 | 0 |
| 0.9798611111111111 | 0 |
| 0.9805555555555556 | 0 |
| 0.9812500000000001 | 0 |
| 0.9819444444444444 | 0 |
| 0.9826388888888888 | 0 |
| 0.9833333333333334 | 0 |
| 0.9840277777777778 | 0 |
| 0.9847222222222222 | 0 |
| 0.9854166666666666 | 0 |
| 0.9861111111111112 | 0 |
| 0.9868055555555556 | 0 |
| 0.9874999999999999 | 0 |
| 0.9881944444444444 | 0 |
| 0.9888888888888889 | 0 |
| 0.9895833333333334 | 0 |
| 0.9902777777777777 | 0 |
| 0.9909722222222223 | 0 |
| 0.9916666666666667 | 0 |
| 0.9923611111111111 | 0 |
| 0.9930555555555555 | 0 |
| 0.99375 | 0 |
| 0.9944444444444445 | 0 |
| 0.9951388888888889 | 0 |
| 0.9958333333333332 | 0 |
| 0.9965277777777778 | 0 |
| 0.9972222222222222 | 0 |
| 0.9979166666666667 | 0 |
| 0.998611111111111 | 0 |
| 0.9993055555555556 | 0 |